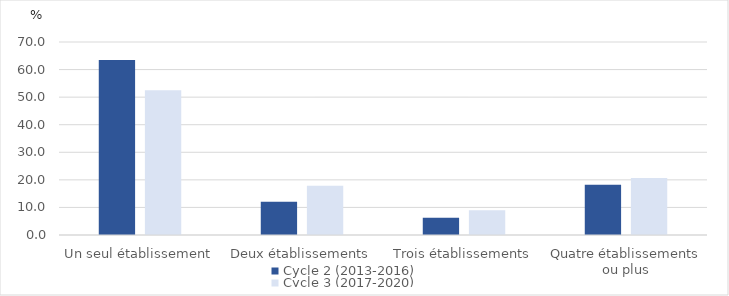
| Category | Cycle 2 (2013-2016) | Cycle 3 (2017-2020) |
|---|---|---|
| Un seul établissement | 63.45 | 52.46 |
| Deux établissements | 12.07 | 17.84 |
| Trois établissements | 6.27 | 9 |
| Quatre établissements ou plus | 18.21 | 20.71 |